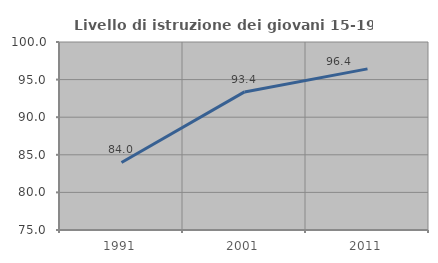
| Category | Livello di istruzione dei giovani 15-19 anni |
|---|---|
| 1991.0 | 83.978 |
| 2001.0 | 93.363 |
| 2011.0 | 96.429 |